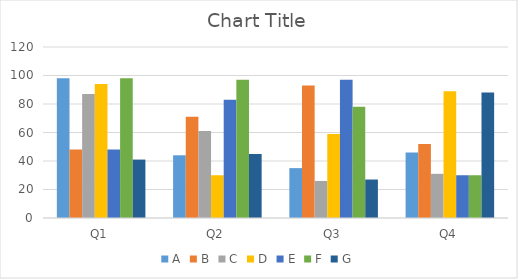
| Category | A | B | C | D | E | F | G |
|---|---|---|---|---|---|---|---|
| Q1 | 98 | 48 | 87 | 94 | 48 | 98 | 41 |
| Q2 | 44 | 71 | 61 | 30 | 83 | 97 | 45 |
| Q3 | 35 | 93 | 26 | 59 | 97 | 78 | 27 |
| Q4 | 46 | 52 | 31 | 89 | 30 | 30 | 88 |